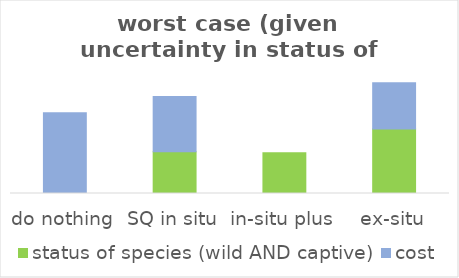
| Category | status of species (wild AND captive) | cost |
|---|---|---|
| do nothing | 0 | 0.333 |
| SQ in situ | 0.172 | 0.228 |
| in-situ plus | 0.169 | 0 |
| ex-situ | 0.266 | 0.191 |